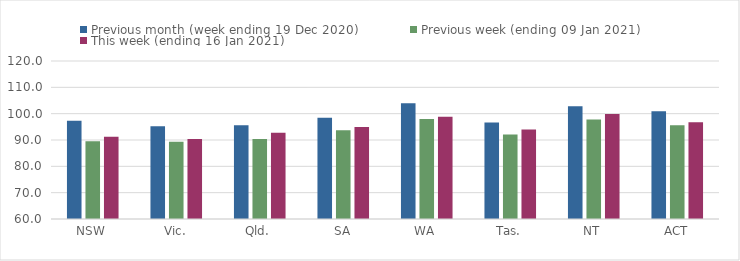
| Category | Previous month (week ending 19 Dec 2020) | Previous week (ending 09 Jan 2021) | This week (ending 16 Jan 2021) |
|---|---|---|---|
| NSW | 97.32 | 89.48 | 91.25 |
| Vic. | 95.21 | 89.3 | 90.42 |
| Qld. | 95.57 | 90.38 | 92.71 |
| SA | 98.45 | 93.68 | 94.95 |
| WA | 103.94 | 97.97 | 98.81 |
| Tas. | 96.65 | 92.11 | 93.95 |
| NT | 102.79 | 97.8 | 99.85 |
| ACT | 100.9 | 95.56 | 96.71 |